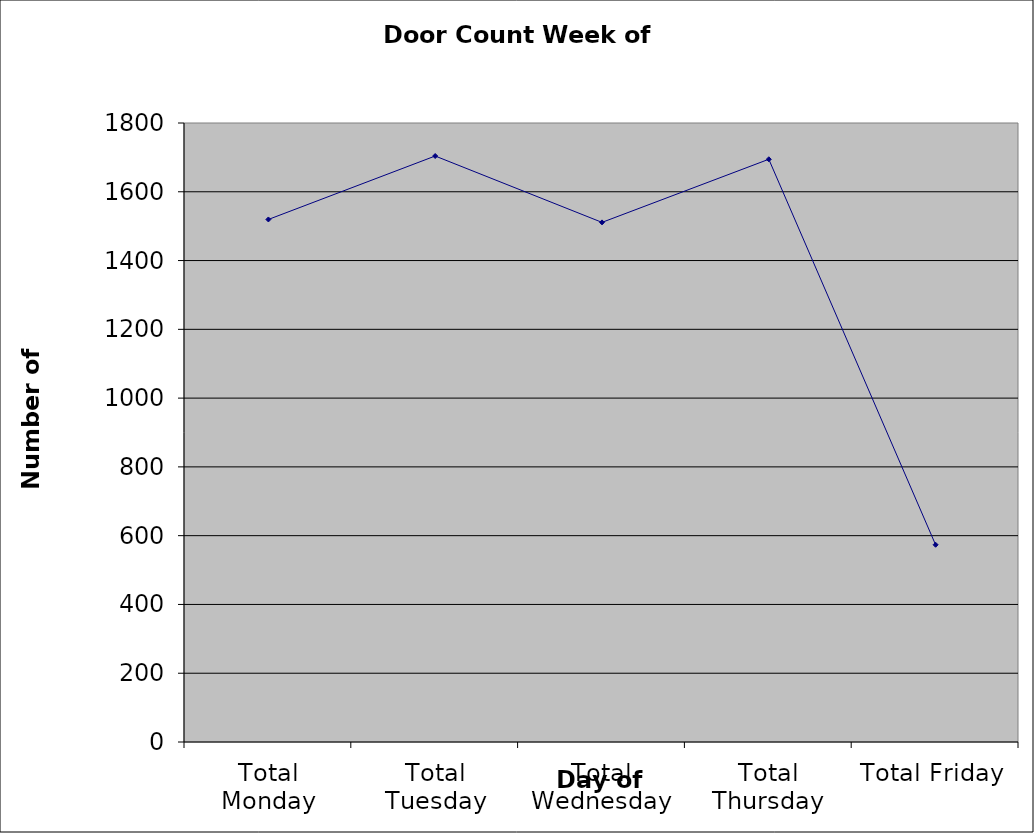
| Category | Series 0 |
|---|---|
| Total Monday | 1519.5 |
| Total Tuesday | 1704 |
| Total Wednesday | 1511 |
| Total Thursday | 1694.5 |
| Total Friday | 573.5 |